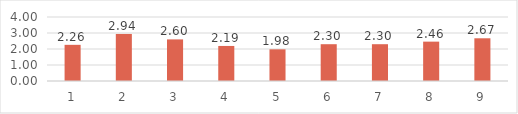
| Category | Series 0 |
|---|---|
| 0 | 2.26 |
| 1 | 2.94 |
| 2 | 2.6 |
| 3 | 2.19 |
| 4 | 1.98 |
| 5 | 2.3 |
| 6 | 2.3 |
| 7 | 2.46 |
| 8 | 2.67 |